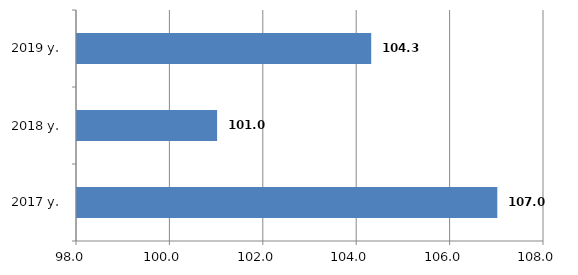
| Category | Series 0 |
|---|---|
| 2017 y. | 107 |
| 2018 y. | 101 |
| 2019 y. | 104.3 |